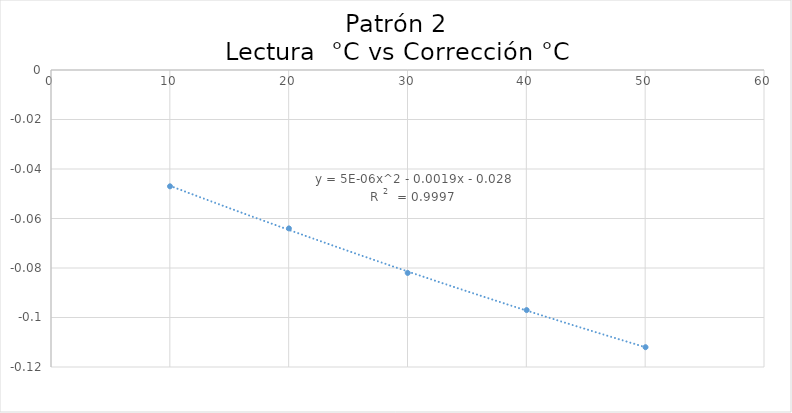
| Category | Series 0 |
|---|---|
| 10.014 | -0.047 |
| 20.021 | -0.064 |
| 30.018 | -0.082 |
| 40.027 | -0.097 |
| 50.03 | -0.112 |